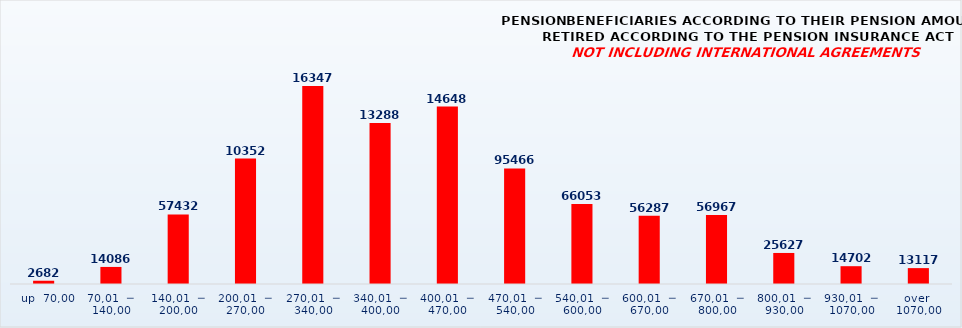
| Category | PENSION BENEFICIARIES ACCORDING TO TYPES AND AMOUNTS OF PENSION, RETIRED ACCORDING TO THE PENSION INSURANCE ACT
NOT INCLUDING INTERNATIONAL AGREEMENTS |
|---|---|
|   up  70,00 | 2682 |
| 70,01  ─  140,00 | 14086 |
| 140,01  ─  200,00 | 57432 |
| 200,01  ─  270,00 | 103522 |
| 270,01  ─  340,00 | 163478 |
| 340,01  ─  400,00 | 132882 |
| 400,01  ─  470,00 | 146481 |
| 470,01  ─  540,00 | 95466 |
| 540,01  ─  600,00 | 66053 |
| 600,01  ─  670,00 | 56287 |
| 670,01  ─  800,00 | 56967 |
| 800,01  ─  930,00 | 25627 |
| 930,01  ─  1070,00 | 14702 |
| over  1070,00 | 13117 |